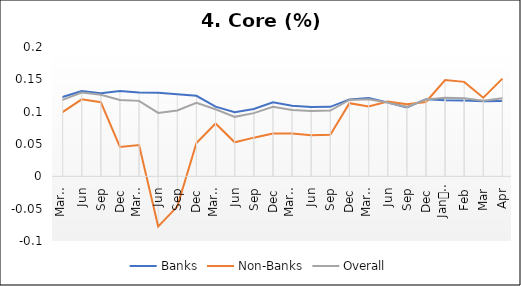
| Category | Banks | Non-Banks | Overall |
|---|---|---|---|
| 0 | 0.123 | 0.099 | 0.118 |
| 1 | 0.132 | 0.119 | 0.13 |
| 2 | 0.128 | 0.115 | 0.126 |
| 3 | 0.132 | 0.046 | 0.118 |
| 4 | 0.13 | 0.048 | 0.117 |
| 5 | 0.129 | -0.077 | 0.098 |
| 6 | 0.127 | -0.047 | 0.102 |
| 7 | 0.125 | 0.052 | 0.114 |
| 8 | 0.108 | 0.082 | 0.104 |
| 9 | 0.099 | 0.053 | 0.092 |
| 10 | 0.104 | 0.06 | 0.098 |
| 11 | 0.114 | 0.066 | 0.108 |
| 12 | 0.109 | 0.066 | 0.102 |
| 13 | 0.107 | 0.063 | 0.101 |
| 14 | 0.108 | 0.064 | 0.102 |
| 15 | 0.119 | 0.113 | 0.118 |
| 16 | 0.121 | 0.108 | 0.119 |
| 17 | 0.114 | 0.116 | 0.114 |
| 18 | 0.107 | 0.111 | 0.107 |
| 19 | 0.119 | 0.115 | 0.119 |
| 20 | 0.118 | 0.149 | 0.122 |
| 21 | 0.117 | 0.146 | 0.121 |
| 22 | 0.116 | 0.122 | 0.117 |
| 23 | 0.116 | 0.151 | 0.121 |